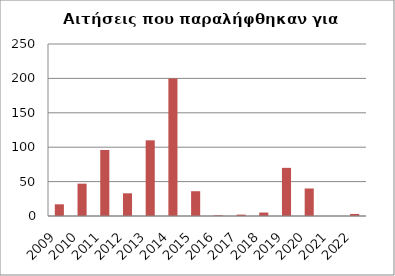
| Category | Series 1 |
|---|---|
| 2009.0 | 17 |
| 2010.0 | 47 |
| 2011.0 | 96 |
| 2012.0 | 33 |
| 2013.0 | 110 |
| 2014.0 | 200 |
| 2015.0 | 36 |
| 2016.0 | 1 |
| 2017.0 | 2 |
| 2018.0 | 5 |
| 2019.0 | 70 |
| 2020.0 | 40 |
| 2021.0 | 0 |
| 2022.0 | 3 |